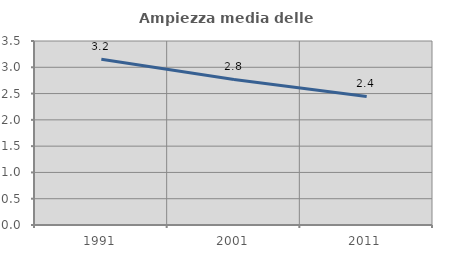
| Category | Ampiezza media delle famiglie |
|---|---|
| 1991.0 | 3.152 |
| 2001.0 | 2.769 |
| 2011.0 | 2.445 |